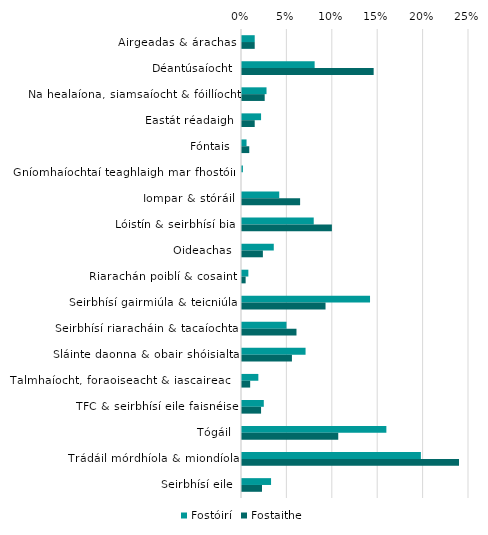
| Category | Fostóirí | Fostaithe |
|---|---|---|
| Airgeadas & árachas | 0.014 | 0.014 |
| Déantúsaíocht | 0.08 | 0.145 |
| Na healaíona, siamsaíocht & fóillíocht | 0.027 | 0.025 |
| Eastát réadaigh | 0.021 | 0.014 |
| Fóntais | 0.005 | 0.008 |
| Gníomhaíochtaí teaghlaigh mar fhostóirí | 0.001 | 0 |
| Iompar & stóráil | 0.041 | 0.064 |
| Lóistín & seirbhísí bia | 0.079 | 0.099 |
| Oideachas | 0.035 | 0.023 |
| Riarachán poiblí & cosaint | 0.007 | 0.004 |
| Seirbhísí gairmiúla & teicniúla | 0.141 | 0.092 |
| Seirbhísí riaracháin & tacaíochta | 0.049 | 0.06 |
| Sláinte daonna & obair shóisialta | 0.07 | 0.055 |
| Talmhaíocht, foraoiseacht & iascaireacht | 0.018 | 0.009 |
| TFC & seirbhísí eile faisnéise | 0.024 | 0.021 |
| Tógáil | 0.159 | 0.106 |
| Trádáil mórdhíola & miondíola | 0.197 | 0.239 |
| Seirbhísí eile | 0.032 | 0.022 |